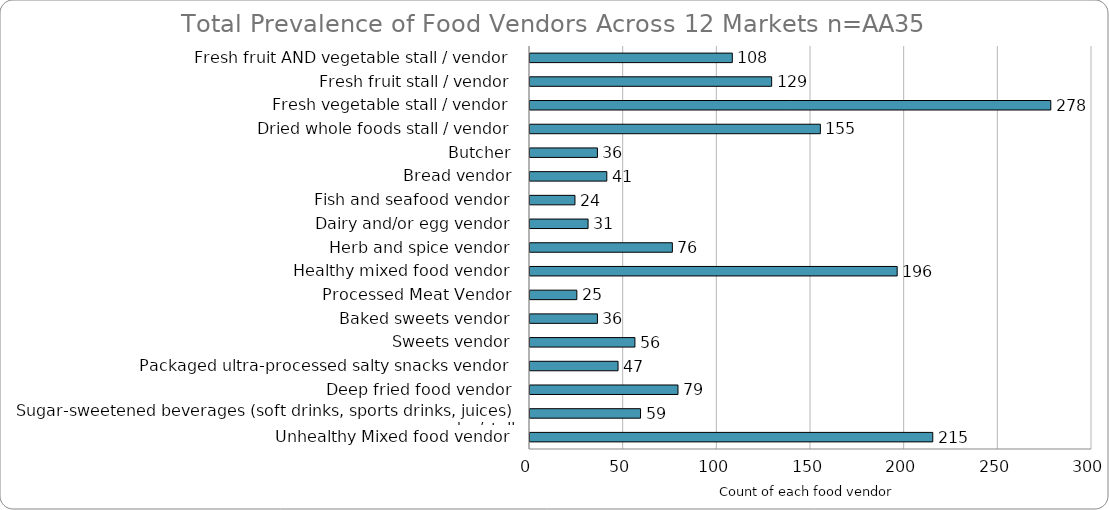
| Category | Total Prevalence of Vendor |
|---|---|
| Fresh fruit AND vegetable stall / vendor | 108 |
| Fresh fruit stall / vendor | 129 |
| Fresh vegetable stall / vendor | 278 |
| Dried whole foods stall / vendor | 155 |
| Butcher | 36 |
| Bread vendor | 41 |
| Fish and seafood vendor | 24 |
| Dairy and/or egg vendor | 31 |
| Herb and spice vendor | 76 |
| Healthy mixed food vendor | 196 |
| Processed Meat Vendor | 25 |
| Baked sweets vendor | 36 |
| Sweets vendor | 56 |
| Packaged ultra-processed salty snacks vendor | 47 |
| Deep fried food vendor | 79 |
| Sugar-sweetened beverages (soft drinks, sports drinks, juices) vendor/stall | 59 |
| Unhealthy Mixed food vendor | 215 |